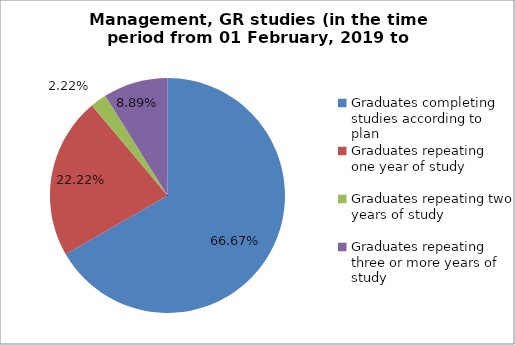
| Category | Series 0 |
|---|---|
| Graduates completing studies according to plan | 66.667 |
| Graduates repeating one year of study | 22.222 |
| Graduates repeating two years of study | 2.222 |
| Graduates repeating three or more years of study | 8.889 |